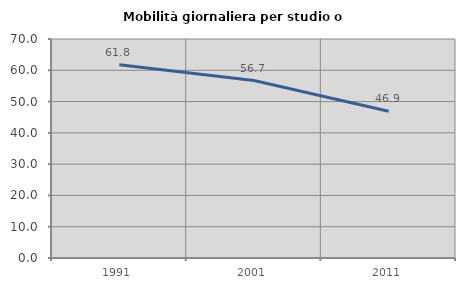
| Category | Mobilità giornaliera per studio o lavoro |
|---|---|
| 1991.0 | 61.806 |
| 2001.0 | 56.721 |
| 2011.0 | 46.909 |